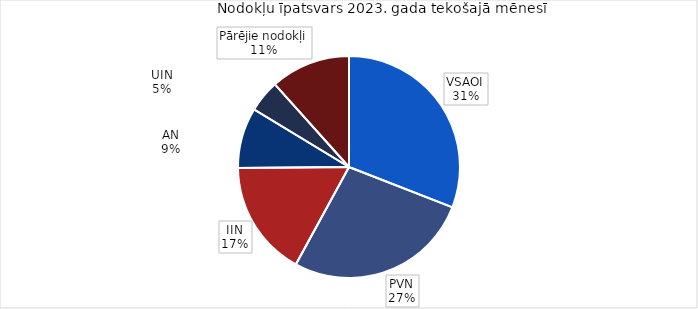
| Category | īpatsvars 2023 |
|---|---|
| VSAOI | 0.309 |
| PVN | 0.27 |
| IIN | 0.169 |
| AN | 0.088 |
| UIN | 0.047 |
| Pārējie nodokļi | 0.116 |